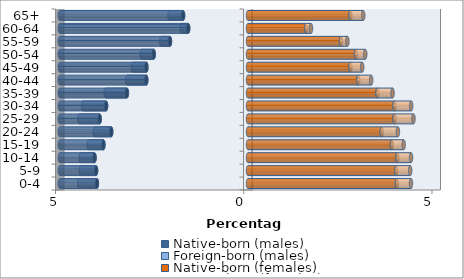
| Category | Native-born (males) | Foreign-born (males) | Native-born (females) | Foreign-born (females) |
|---|---|---|---|---|
| 0-4 | -4.013 | -0.471 | 3.956 | 0.373 |
| 5-9 | -4.036 | -0.402 | 3.938 | 0.371 |
| 10-14 | -4.076 | -0.367 | 3.967 | 0.364 |
| 15-19 | -3.84 | -0.391 | 3.822 | 0.314 |
| 20-24 | -3.633 | -0.435 | 3.554 | 0.428 |
| 25-29 | -3.94 | -0.539 | 3.893 | 0.502 |
| 30-34 | -3.77 | -0.613 | 3.892 | 0.443 |
| 35-39 | -3.216 | -0.563 | 3.44 | 0.4 |
| 40-44 | -2.701 | -0.507 | 2.928 | 0.343 |
| 45-49 | -2.7 | -0.358 | 2.724 | 0.31 |
| 50-54 | -2.504 | -0.321 | 2.868 | 0.247 |
| 55-59 | -2.072 | -0.229 | 2.469 | 0.172 |
| 60-64 | -1.589 | -0.177 | 1.546 | 0.127 |
| 65+ | -1.723 | -0.362 | 2.722 | 0.34 |